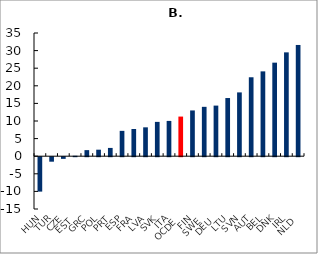
| Category | Series 0 |
|---|---|
| HUN | -9.775 |
| TUR | -1.275 |
| CZE | -0.475 |
| EST | 0.125 |
| GRC | 1.725 |
| POL | 1.85 |
| PRT | 2.35 |
| ESP | 7.2 |
| FRA | 7.725 |
| LVA | 8.2 |
| SVK | 9.75 |
| ITA | 10.025 |
| OCDE | 11.258 |
| FIN | 13 |
| SWE | 14.025 |
| DEU | 14.375 |
| LTU | 16.525 |
| SVN | 18.125 |
| AUT | 22.425 |
| BEL | 24.1 |
| DNK | 26.575 |
| IRL | 29.5 |
| NLD | 31.6 |